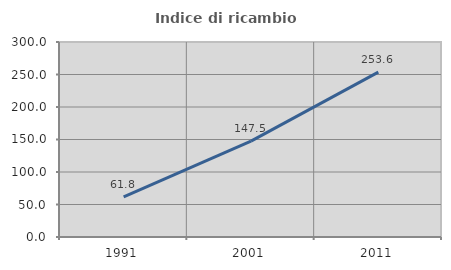
| Category | Indice di ricambio occupazionale  |
|---|---|
| 1991.0 | 61.78 |
| 2001.0 | 147.49 |
| 2011.0 | 253.591 |